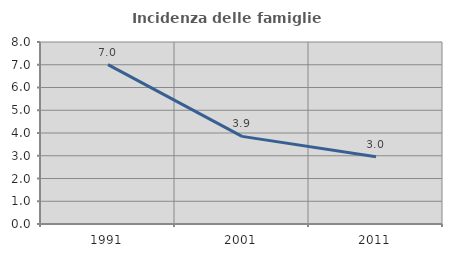
| Category | Incidenza delle famiglie numerose |
|---|---|
| 1991.0 | 7.008 |
| 2001.0 | 3.851 |
| 2011.0 | 2.952 |